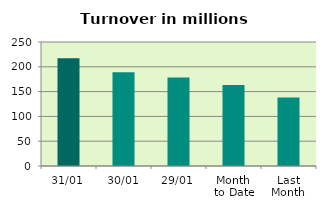
| Category | Series 0 |
|---|---|
| 31/01 | 217.147 |
| 30/01 | 188.783 |
| 29/01 | 178.521 |
| Month 
to Date | 163.101 |
| Last
Month | 138.201 |